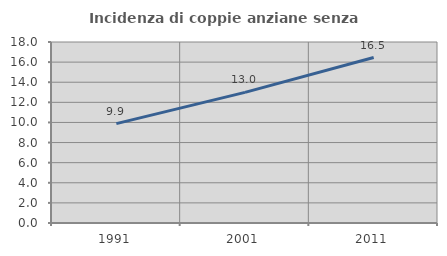
| Category | Incidenza di coppie anziane senza figli  |
|---|---|
| 1991.0 | 9.882 |
| 2001.0 | 12.99 |
| 2011.0 | 16.451 |